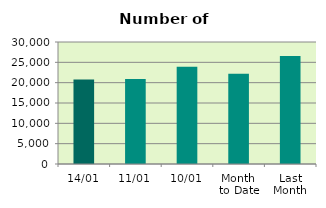
| Category | Series 0 |
|---|---|
| 14/01 | 20762 |
| 11/01 | 20912 |
| 10/01 | 23934 |
| Month 
to Date | 22220.889 |
| Last
Month | 26558.947 |